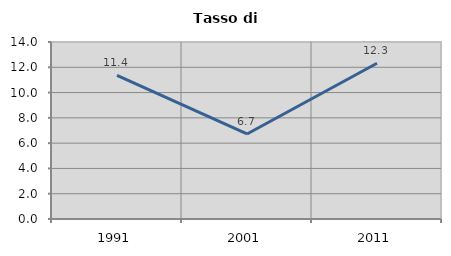
| Category | Tasso di disoccupazione   |
|---|---|
| 1991.0 | 11.367 |
| 2001.0 | 6.725 |
| 2011.0 | 12.316 |